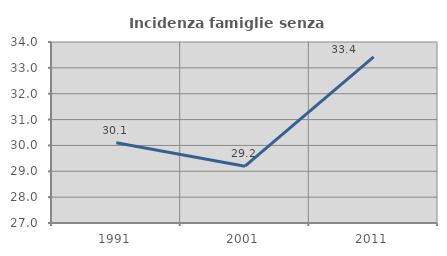
| Category | Incidenza famiglie senza nuclei |
|---|---|
| 1991.0 | 30.1 |
| 2001.0 | 29.198 |
| 2011.0 | 33.428 |